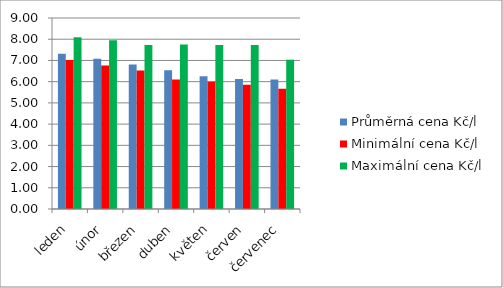
| Category | Průměrná cena Kč/l | Minimální cena Kč/l | Maximální cena Kč/l |
|---|---|---|---|
| leden | 7.32 | 7.02 | 8.09 |
| únor | 7.08 | 6.76 | 7.95 |
| březen | 6.81 | 6.53 | 7.73 |
| duben | 6.54 | 6.1 | 7.75 |
| květen | 6.25 | 6 | 7.73 |
| červen | 6.12 | 5.86 | 7.73 |
| červenec | 6.1 | 5.67 | 7.03 |